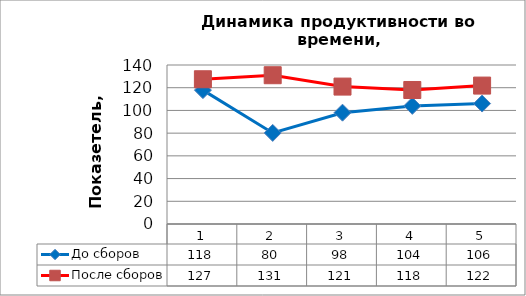
| Category | До сборов | После сборов |
|---|---|---|
| 0 | 117.871 | 127.448 |
| 1 | 80.182 | 131 |
| 2 | 98 | 121 |
| 3 | 104 | 118 |
| 4 | 106.054 | 121.875 |